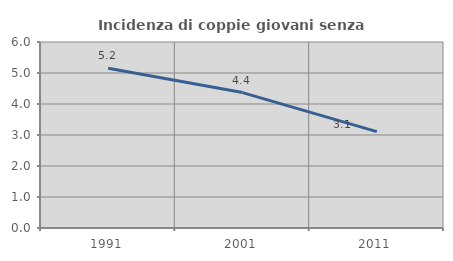
| Category | Incidenza di coppie giovani senza figli |
|---|---|
| 1991.0 | 5.151 |
| 2001.0 | 4.368 |
| 2011.0 | 3.109 |